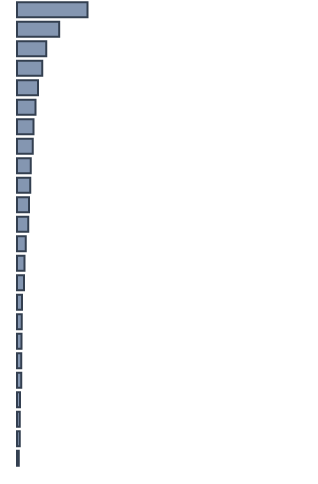
| Category | Percentatge |
|---|---|
| 0 | 23.9 |
| 1 | 14.3 |
| 2 | 9.9 |
| 3 | 8.6 |
| 4 | 7.1 |
| 5 | 6.3 |
| 6 | 5.6 |
| 7 | 5.3 |
| 8 | 4.7 |
| 9 | 4.5 |
| 10 | 4.1 |
| 11 | 3.8 |
| 12 | 3 |
| 13 | 2.5 |
| 14 | 2.4 |
| 15 | 1.7 |
| 16 | 1.6 |
| 17 | 1.5 |
| 18 | 1.4 |
| 19 | 1.4 |
| 20 | 1 |
| 21 | 0.9 |
| 22 | 0.9 |
| 23 | 0.6 |